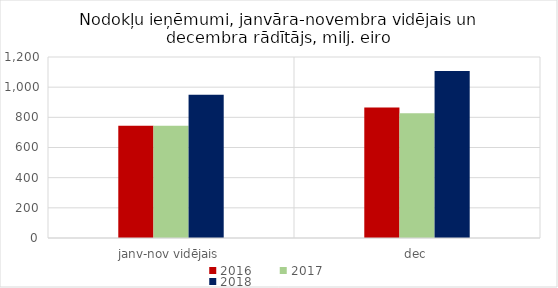
| Category | 2016 | 2017 | 2018 |
|---|---|---|---|
| janv-nov vidējais | 744687.411 | 743640.949 | 949988.056 |
| dec | 865773.712 | 826496.37 | 1107409.079 |